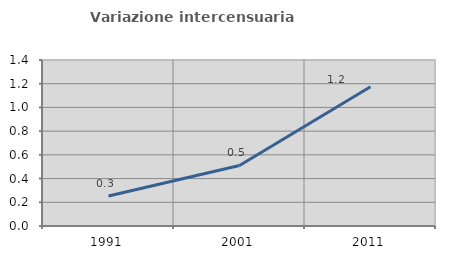
| Category | Variazione intercensuaria annua |
|---|---|
| 1991.0 | 0.253 |
| 2001.0 | 0.511 |
| 2011.0 | 1.174 |